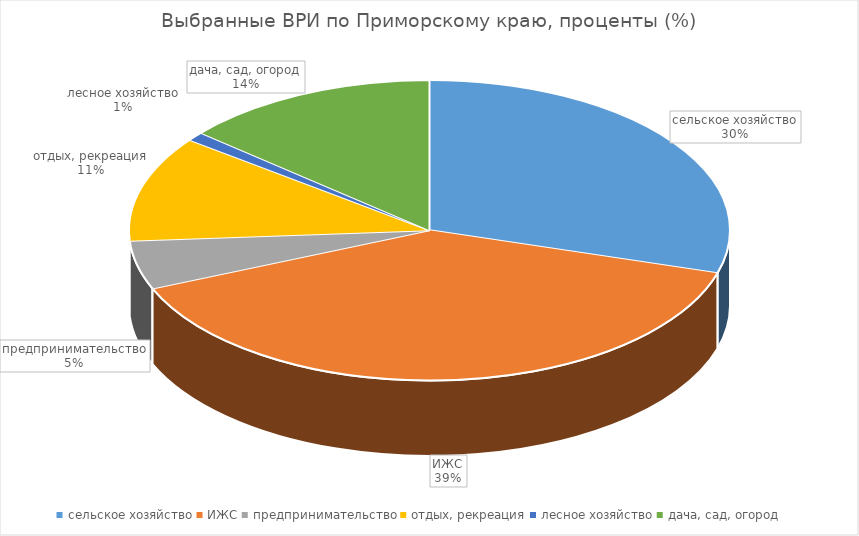
| Category | Приморский край |
|---|---|
| сельское хозяйство | 29.628 |
| ИЖС | 39.028 |
| предпринимательство | 5.242 |
| отдых, рекреация | 11.376 |
| лесное хозяйство | 0.961 |
| дача, сад, огород | 13.764 |